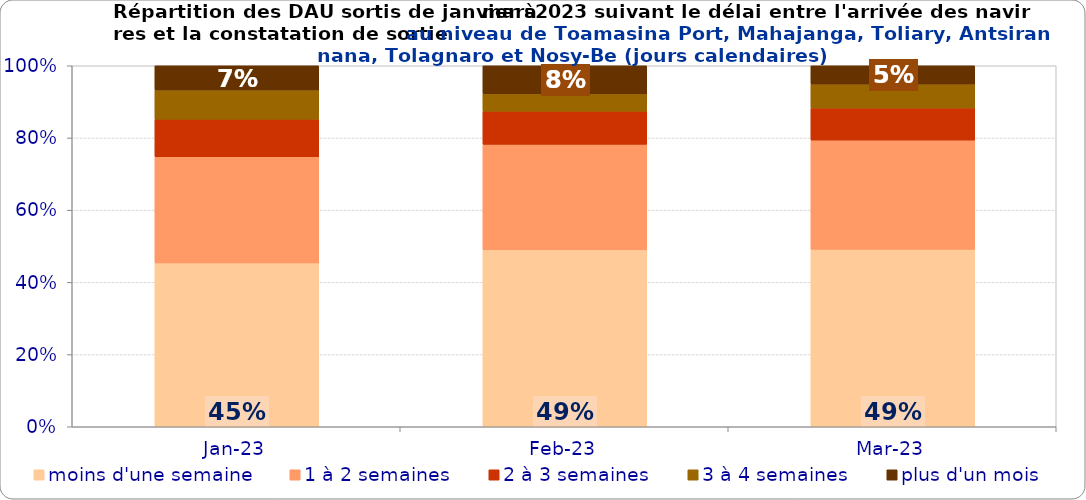
| Category | moins d'une semaine | 1 à 2 semaines | 2 à 3 semaines | 3 à 4 semaines | plus d'un mois |
|---|---|---|---|---|---|
| 2023-01-01 | 0.454 | 0.294 | 0.104 | 0.081 | 0.067 |
| 2023-02-01 | 0.49 | 0.292 | 0.092 | 0.048 | 0.078 |
| 2023-03-01 | 0.492 | 0.303 | 0.089 | 0.066 | 0.051 |